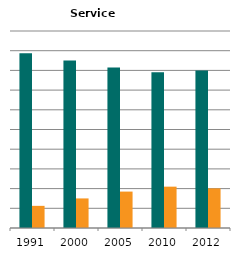
| Category | Male | Female |
|---|---|---|
| 1991.0 | 0.888 | 0.112 |
| 2000.0 | 0.85 | 0.15 |
| 2005.0 | 0.815 | 0.185 |
| 2010.0 | 0.79 | 0.21 |
| 2012.0 | 0.799 | 0.201 |